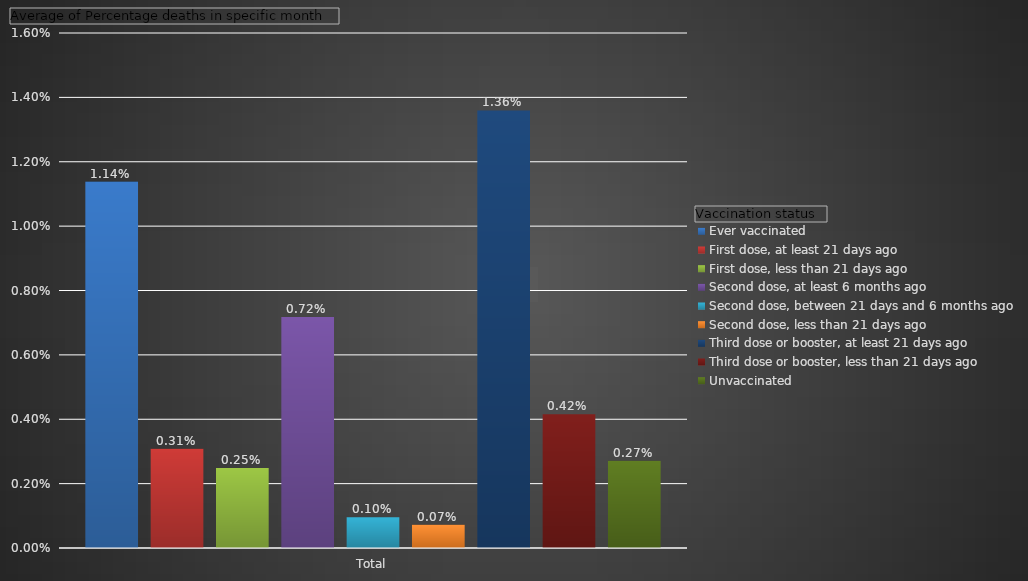
| Category | Ever vaccinated | First dose, at least 21 days ago | First dose, less than 21 days ago | Second dose, at least 6 months ago | Second dose, between 21 days and 6 months ago | Second dose, less than 21 days ago | Third dose or booster, at least 21 days ago | Third dose or booster, less than 21 days ago | Unvaccinated |
|---|---|---|---|---|---|---|---|---|---|
| Total | 0.011 | 0.003 | 0.002 | 0.007 | 0.001 | 0.001 | 0.014 | 0.004 | 0.003 |